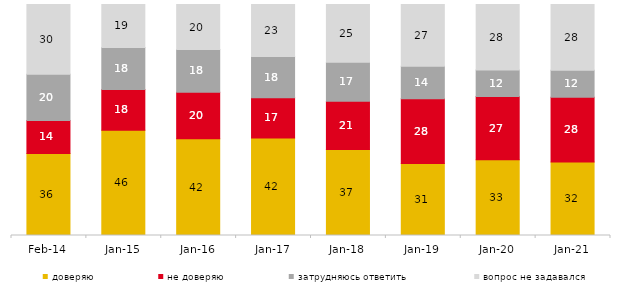
| Category | доверяю | не доверяю | затрудняюсь ответить | вопрос не задавался |
|---|---|---|---|---|
| 2014-02-01 | 35.55 | 14.25 | 20.05 | 30.15 |
| 2015-01-01 | 45.6 | 17.6 | 18.2 | 18.6 |
| 2016-01-01 | 41.9 | 20.15 | 18.45 | 19.5 |
| 2017-01-01 | 42.2 | 17.45 | 17.8 | 22.55 |
| 2018-01-01 | 37.25 | 20.85 | 16.95 | 24.95 |
| 2019-01-01 | 31.15 | 28.1 | 14 | 26.75 |
| 2020-01-01 | 32.822 | 27.327 | 11.535 | 28.317 |
| 2021-01-01 | 31.793 | 28.018 | 11.724 | 28.465 |